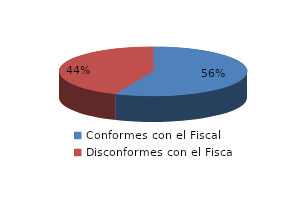
| Category | Series 0 |
|---|---|
| 0 | 74 |
| 1 | 57 |